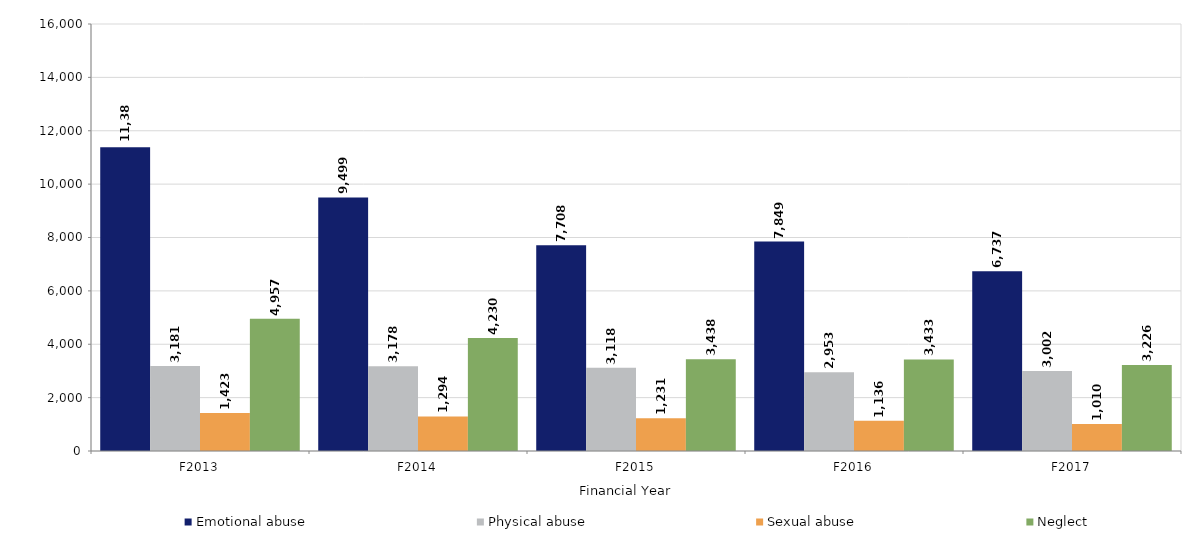
| Category | Emotional abuse | Physical abuse | Sexual abuse | Neglect |
|---|---|---|---|---|
| F2013 | 11386 | 3181 | 1423 | 4957 |
| F2014 | 9499 | 3178 | 1294 | 4230 |
| F2015 | 7708 | 3118 | 1231 | 3438 |
| F2016 | 7849 | 2953 | 1136 | 3433 |
| F2017 | 6737 | 3002 | 1010 | 3226 |